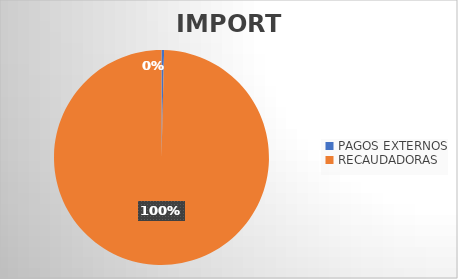
| Category | IMPORTE |
|---|---|
| PAGOS EXTERNOS | 722231.58 |
| RECAUDADORAS | 185505792.7 |